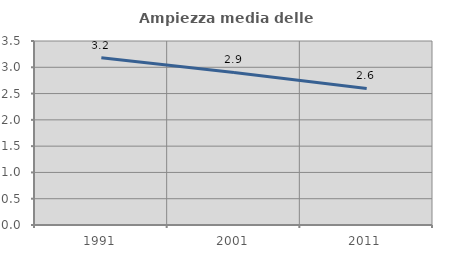
| Category | Ampiezza media delle famiglie |
|---|---|
| 1991.0 | 3.182 |
| 2001.0 | 2.901 |
| 2011.0 | 2.597 |